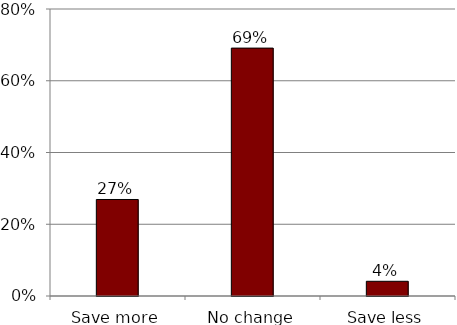
| Category | Series 0 |
|---|---|
| Save more | 0.269 |
| No change | 0.691 |
| Save less | 0.041 |